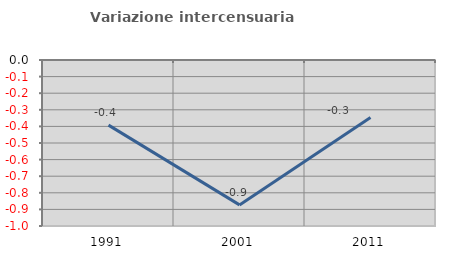
| Category | Variazione intercensuaria annua |
|---|---|
| 1991.0 | -0.392 |
| 2001.0 | -0.873 |
| 2011.0 | -0.346 |